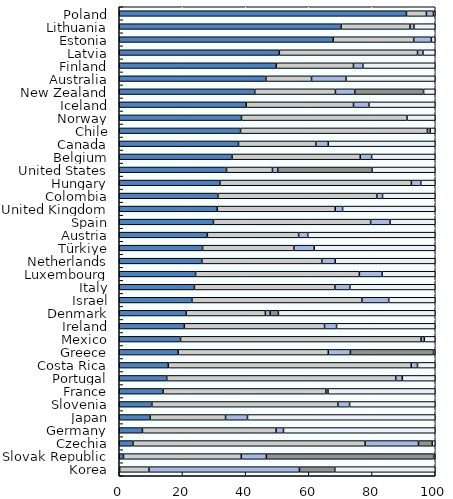
| Category | Equity | Bills and bonds | Cash and deposits | CIS (when look-through unavailable) | Other |
|---|---|---|---|---|---|
| Poland | 90.88 | 6.334 | 2.213 | 0 | 0.574 |
| Lithuania | 70.207 | 21.794 | 1.264 | 0 | 6.735 |
| Estonia | 67.713 | 25.468 | 5.59 | 0 | 1.229 |
| Latvia | 50.656 | 43.738 | 1.714 | 0 | 3.892 |
| Finland | 49.694 | 24.429 | 2.982 | 0 | 22.895 |
| Australia | 46.421 | 14.431 | 10.92 | 0 | 28.229 |
| New Zealand | 42.886 | 25.523 | 6.123 | 21.777 | 3.691 |
| Iceland | 40.188 | 33.942 | 4.903 | 0 | 20.966 |
| Norway | 38.679 | 52.39 | 0 | 0 | 8.931 |
| Chile | 38.39 | 59.135 | 0.873 | 0 | 1.602 |
| Canada | 37.736 | 24.456 | 3.937 | 0 | 33.871 |
| Belgium | 35.699 | 40.567 | 3.602 | 0 | 20.131 |
| United States | 33.956 | 14.526 | 1.684 | 29.817 | 20.017 |
| Hungary | 31.883 | 60.556 | 2.981 | 0 | 4.581 |
| Colombia | 31.229 | 50.302 | 1.788 | 0 | 16.68 |
| United Kingdom | 31.001 | 37.352 | 2.323 | 0 | 29.324 |
| Spain | 29.817 | 49.722 | 6.165 | 0 | 14.295 |
| Austria | 27.873 | 28.893 | 2.878 | 0 | 40.356 |
| Türkiye | 26.378 | 28.891 | 6.419 | 0 | 38.312 |
| Netherlands | 26.153 | 37.946 | 4.238 | 0 | 31.663 |
| Luxembourg | 24.156 | 51.838 | 7.198 | 0 | 16.808 |
| Italy | 23.788 | 44.459 | 4.739 | 0 | 27.013 |
| Israel | 22.997 | 53.792 | 8.485 | 0 | 14.726 |
| Denmark | 21.166 | 25.072 | 1.49 | 2.63 | 49.642 |
| Ireland | 20.596 | 44.363 | 3.812 | 0 | 31.229 |
| Mexico | 19.408 | 76.123 | 1.002 | 0 | 3.466 |
| Greece | 18.645 | 47.508 | 7 | 26.309 | 0.538 |
| Costa Rica | 15.519 | 76.885 | 1.983 | 0 | 5.613 |
| Portugal | 15.017 | 72.479 | 2.085 | 0 | 10.419 |
| France | 13.876 | 51.517 | 0.667 | 0 | 33.94 |
| Slovenia | 10.323 | 58.843 | 3.728 | 0 | 27.106 |
| Japan | 9.757 | 23.883 | 6.945 | 0 | 59.415 |
| Germany | 7.333 | 42.309 | 2.33 | 0 | 48.028 |
| Czechia | 4.347 | 73.455 | 16.886 | 4.334 | 0.978 |
| Slovak Republic | 1.34 | 37.28 | 7.921 | 52.979 | 0.481 |
| Korea | 0.116 | 9.261 | 47.636 | 11.199 | 31.788 |